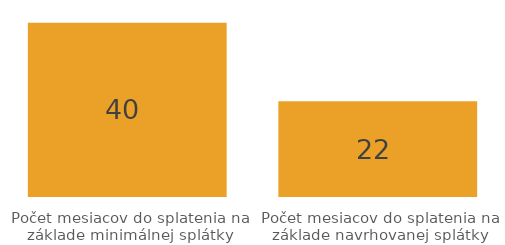
| Category | Series 0 |
|---|---|
| Počet mesiacov do splatenia na základe minimálnej splátky | 40 |
| Počet mesiacov do splatenia na základe navrhovanej splátky | 22 |